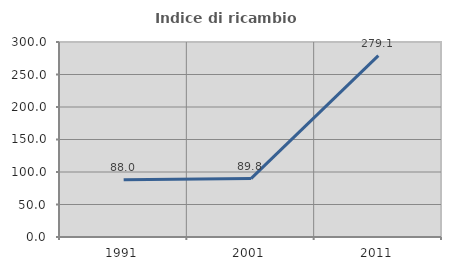
| Category | Indice di ricambio occupazionale  |
|---|---|
| 1991.0 | 87.958 |
| 2001.0 | 89.831 |
| 2011.0 | 279.121 |